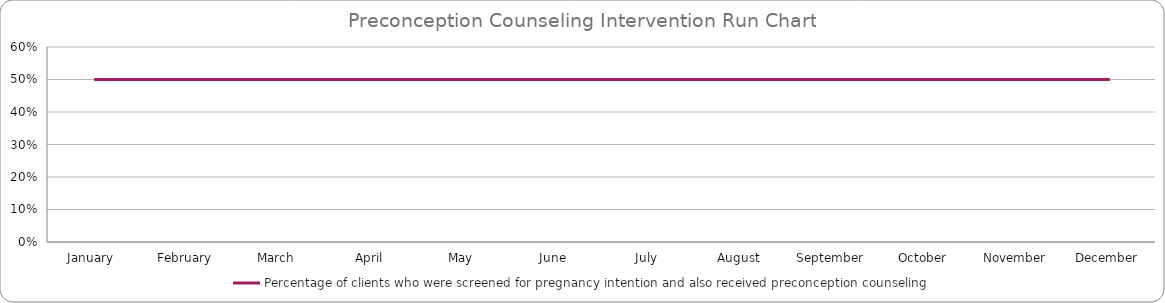
| Category | Percentage of clients who were screened for pregnancy intention and also received preconception counseling |
|---|---|
| January  | 0.5 |
| February | 0.5 |
| March | 0.5 |
| April | 0.5 |
| May | 0.5 |
| June | 0.5 |
| July | 0.5 |
| August | 0.5 |
| September | 0.5 |
| October | 0.5 |
| November | 0.5 |
| December | 0.5 |